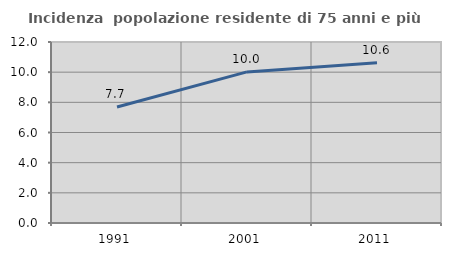
| Category | Incidenza  popolazione residente di 75 anni e più |
|---|---|
| 1991.0 | 7.688 |
| 2001.0 | 10.019 |
| 2011.0 | 10.628 |